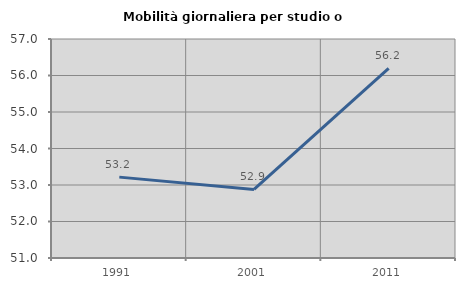
| Category | Mobilità giornaliera per studio o lavoro |
|---|---|
| 1991.0 | 53.216 |
| 2001.0 | 52.879 |
| 2011.0 | 56.195 |